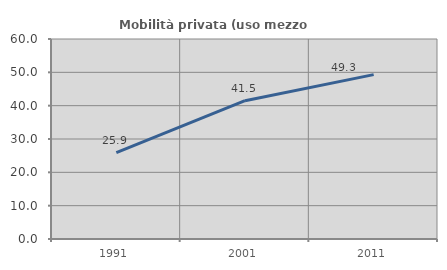
| Category | Mobilità privata (uso mezzo privato) |
|---|---|
| 1991.0 | 25.926 |
| 2001.0 | 41.497 |
| 2011.0 | 49.315 |